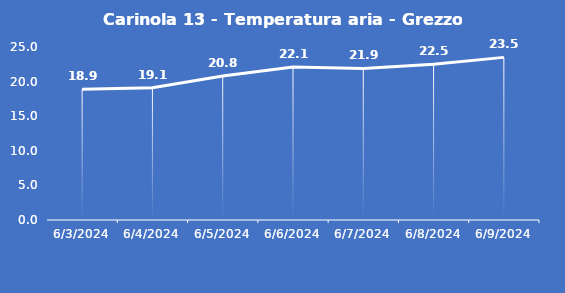
| Category | Carinola 13 - Temperatura aria - Grezzo (°C) |
|---|---|
| 6/3/24 | 18.9 |
| 6/4/24 | 19.1 |
| 6/5/24 | 20.8 |
| 6/6/24 | 22.1 |
| 6/7/24 | 21.9 |
| 6/8/24 | 22.5 |
| 6/9/24 | 23.5 |